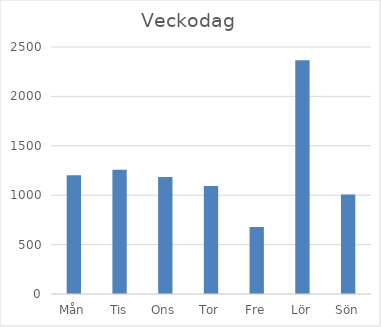
| Category | Summa |
|---|---|
| Mån | 1203 |
| Tis | 1257 |
| Ons | 1183 |
| Tor | 1092 |
| Fre | 678 |
| Lör | 2367 |
| Sön | 1007 |